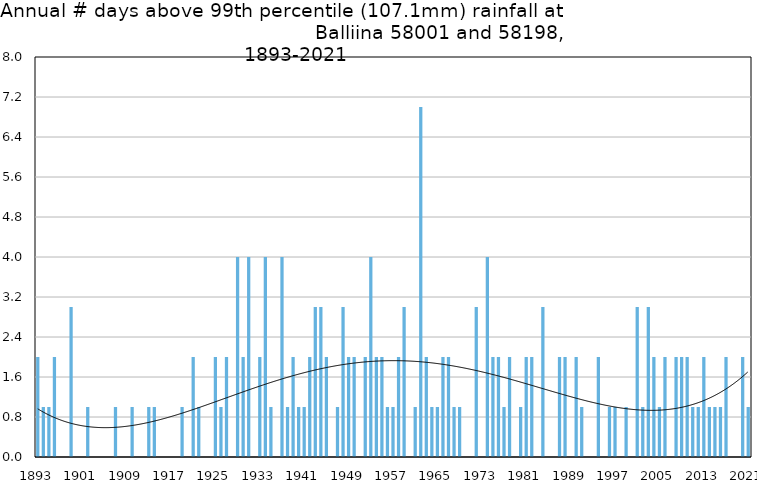
| Category | Annual # days above 99th percentile |
|---|---|
| 1893 | 2 |
| 1894 | 1 |
| 1895 | 1 |
| 1896 | 2 |
| 1897 | 0 |
| 1898 | 0 |
| 1899 | 3 |
| 1900 | 0 |
| 1901 | 0 |
| 1902 | 1 |
| 1903 | 0 |
| 1904 | 0 |
| 1905 | 0 |
| 1906 | 0 |
| 1907 | 1 |
| 1908 | 0 |
| 1909 | 0 |
| 1910 | 1 |
| 1911 | 0 |
| 1912 | 0 |
| 1913 | 1 |
| 1914 | 1 |
| 1915 | 0 |
| 1916 | 0 |
| 1917 | 0 |
| 1918 | 0 |
| 1919 | 1 |
| 1920 | 0 |
| 1921 | 2 |
| 1922 | 1 |
| 1923 | 0 |
| 1924 | 0 |
| 1925 | 2 |
| 1926 | 1 |
| 1927 | 2 |
| 1928 | 0 |
| 1929 | 4 |
| 1930 | 2 |
| 1931 | 4 |
| 1932 | 0 |
| 1933 | 2 |
| 1934 | 4 |
| 1935 | 1 |
| 1936 | 0 |
| 1937 | 4 |
| 1938 | 1 |
| 1939 | 2 |
| 1940 | 1 |
| 1941 | 1 |
| 1942 | 2 |
| 1943 | 3 |
| 1944 | 3 |
| 1945 | 2 |
| 1946 | 0 |
| 1947 | 1 |
| 1948 | 3 |
| 1949 | 2 |
| 1950 | 2 |
| 1951 | 0 |
| 1952 | 2 |
| 1953 | 4 |
| 1954 | 2 |
| 1955 | 2 |
| 1956 | 1 |
| 1957 | 1 |
| 1958 | 2 |
| 1959 | 3 |
| 1960 | 0 |
| 1961 | 1 |
| 1962 | 7 |
| 1963 | 2 |
| 1964 | 1 |
| 1965 | 1 |
| 1966 | 2 |
| 1967 | 2 |
| 1968 | 1 |
| 1969 | 1 |
| 1970 | 0 |
| 1971 | 0 |
| 1972 | 3 |
| 1973 | 0 |
| 1974 | 4 |
| 1975 | 2 |
| 1976 | 2 |
| 1977 | 1 |
| 1978 | 2 |
| 1979 | 0 |
| 1980 | 1 |
| 1981 | 2 |
| 1982 | 2 |
| 1983 | 0 |
| 1984 | 3 |
| 1985 | 0 |
| 1986 | 0 |
| 1987 | 2 |
| 1988 | 2 |
| 1989 | 0 |
| 1990 | 2 |
| 1991 | 1 |
| 1992 | 0 |
| 1993 | 0 |
| 1994 | 2 |
| 1995 | 0 |
| 1996 | 1 |
| 1997 | 1 |
| 1998 | 0 |
| 1999 | 1 |
| 2000 | 0 |
| 2001 | 3 |
| 2002 | 1 |
| 2003 | 3 |
| 2004 | 2 |
| 2005 | 1 |
| 2006 | 2 |
| 2007 | 0 |
| 2008 | 2 |
| 2009 | 2 |
| 2010 | 2 |
| 2011 | 1 |
| 2012 | 1 |
| 2013 | 2 |
| 2014 | 1 |
| 2015 | 1 |
| 2016 | 1 |
| 2017 | 2 |
| 2018 | 0 |
| 2019 | 0 |
| 2020 | 2 |
| 2021 | 1 |